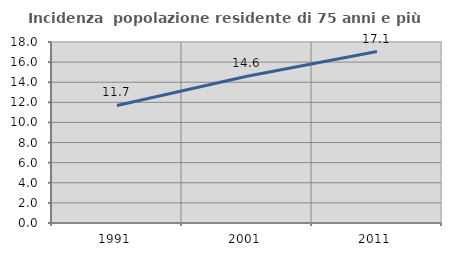
| Category | Incidenza  popolazione residente di 75 anni e più |
|---|---|
| 1991.0 | 11.685 |
| 2001.0 | 14.6 |
| 2011.0 | 17.055 |